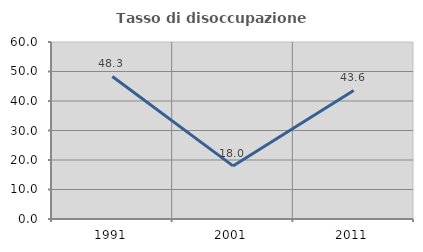
| Category | Tasso di disoccupazione giovanile  |
|---|---|
| 1991.0 | 48.315 |
| 2001.0 | 18 |
| 2011.0 | 43.59 |